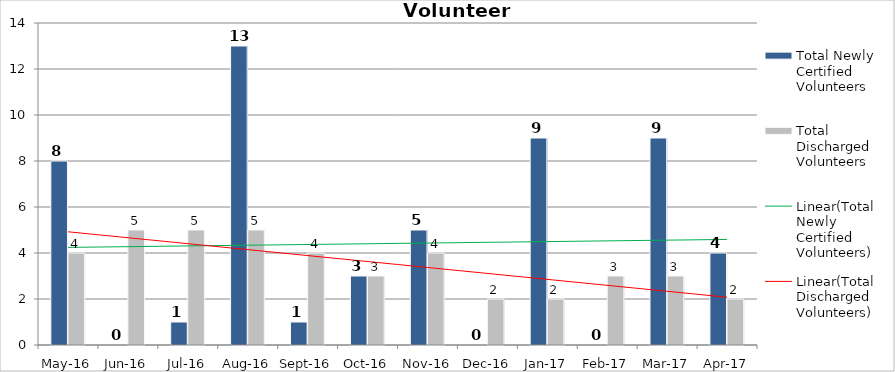
| Category | Total Newly Certified Volunteers | Total Discharged Volunteers |
|---|---|---|
| May-16 | 8 | 4 |
| Jun-16 | 0 | 5 |
| Jul-16 | 1 | 5 |
| Aug-16 | 13 | 5 |
| Sep-16 | 1 | 4 |
| Oct-16 | 3 | 3 |
| Nov-16 | 5 | 4 |
| Dec-16 | 0 | 2 |
| Jan-17 | 9 | 2 |
| Feb-17 | 0 | 3 |
| Mar-17 | 9 | 3 |
| Apr-17 | 4 | 2 |